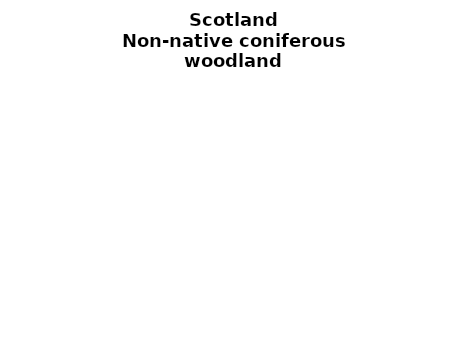
| Category | Non-native coniferous woodland |
|---|---|
| None | 0.194 |
| Seedlings only | 0 |
| Seedlings, saplings only | 0.053 |
| Seedlings, saplings, <7 cm trees | 0.035 |
| Saplings only | 0.164 |
| <7 cm trees, seedlings only | 0 |
| <7 cm trees, saplings only | 0.244 |
| <7 cm Trees only | 0.309 |